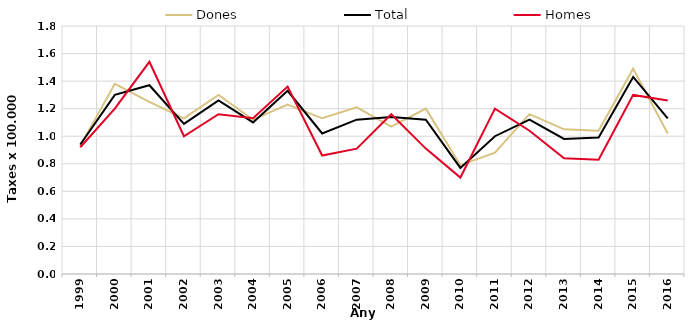
| Category | Dones | Total | Homes |
|---|---|---|---|
| 1999.0 | 0.93 | 0.94 | 0.92 |
| 2000.0 | 1.38 | 1.3 | 1.2 |
| 2001.0 | 1.25 | 1.37 | 1.54 |
| 2002.0 | 1.13 | 1.09 | 1 |
| 2003.0 | 1.3 | 1.26 | 1.16 |
| 2004.0 | 1.12 | 1.1 | 1.13 |
| 2005.0 | 1.23 | 1.33 | 1.36 |
| 2006.0 | 1.13 | 1.02 | 0.86 |
| 2007.0 | 1.21 | 1.12 | 0.91 |
| 2008.0 | 1.07 | 1.14 | 1.16 |
| 2009.0 | 1.2 | 1.12 | 0.91 |
| 2010.0 | 0.79 | 0.77 | 0.7 |
| 2011.0 | 0.88 | 1 | 1.2 |
| 2012.0 | 1.16 | 1.12 | 1.04 |
| 2013.0 | 1.05 | 0.98 | 0.84 |
| 2014.0 | 1.04 | 0.99 | 0.83 |
| 2015.0 | 1.49 | 1.43 | 1.3 |
| 2016.0 | 1.02 | 1.13 | 1.26 |